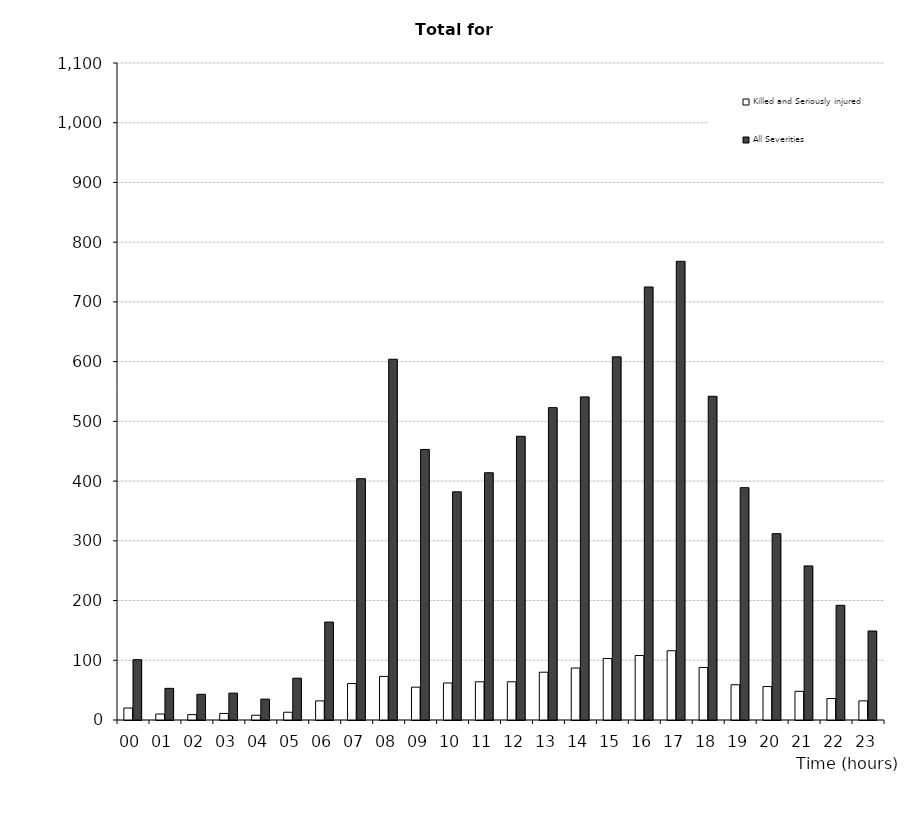
| Category | Killed and Seriously injured | All Severities |
|---|---|---|
| 00 | 20 | 101 |
| 01 | 10 | 53 |
| 02 | 9 | 43 |
| 03 | 11 | 45 |
| 04 | 8 | 35 |
| 05 | 13 | 70 |
| 06 | 32 | 164 |
| 07 | 61 | 404 |
| 08 | 73 | 604 |
| 09 | 55 | 453 |
| 10 | 62 | 382 |
| 11 | 64 | 414 |
| 12 | 64 | 475 |
| 13 | 80 | 523 |
| 14 | 87 | 541 |
| 15 | 103 | 608 |
| 16 | 108 | 725 |
| 17 | 116 | 768 |
| 18 | 88 | 542 |
| 19 | 59 | 389 |
| 20 | 56 | 312 |
| 21 | 48 | 258 |
| 22 | 36 | 192 |
| 23 | 32 | 149 |